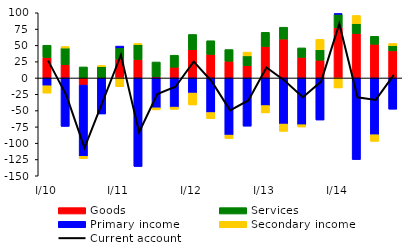
| Category | Goods | Services | Primary income | Secondary income |
|---|---|---|---|---|
| I/10 | 31.462 | 18.784 | -11.909 | -11.331 |
| II | 20.388 | 25.54 | -74.248 | 2.332 |
| III | -10.892 | 16.968 | -109.141 | -3.653 |
| IV | -0.568 | 17.184 | -54.632 | 1.941 |
| I/11 | 28.994 | 17.24 | 2.716 | -13.37 |
| II | 28.218 | 22.874 | -135.675 | 1.741 |
| III | 1.774 | 22.739 | -45.729 | -3.187 |
| IV | 16.492 | 18.43 | -44.657 | -3.399 |
| I/12 | 43.281 | 23.478 | -23.083 | -18.258 |
| II | 36.152 | 20.972 | -52.981 | -9.36 |
| III | 25.681 | 17.923 | -87.565 | -5.364 |
| IV | 18.683 | 15.252 | -73.899 | 5.772 |
| I/13 | 48.355 | 21.702 | -42.281 | -11.28 |
| II | 59.692 | 18.186 | -70.624 | -11.218 |
| III | 31.672 | 14.458 | -71.638 | -3.56 |
| IV | 27.254 | 16.013 | -64.475 | 15.96 |
| I/14 | 77.394 | 20.418 | 1.008 | -15.254 |
| II | 68.219 | 15.152 | -125.09 | 12.495 |
| III | 51.694 | 12.235 | -87.004 | -10.21 |
| IV | 41.587 | 8.072 | -47.876 | 3.26 |